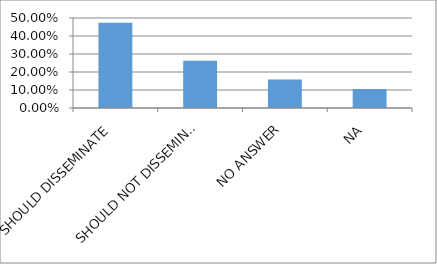
| Category | Series 0 |
|---|---|
| SHOULD DISSEMINATE | 0.474 |
| SHOULD NOT DISSEMINATE | 0.263 |
| NO ANSWER | 0.158 |
| NA  | 0.105 |